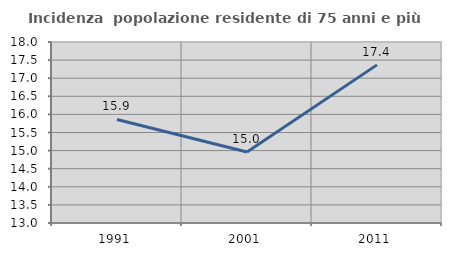
| Category | Incidenza  popolazione residente di 75 anni e più |
|---|---|
| 1991.0 | 15.86 |
| 2001.0 | 14.963 |
| 2011.0 | 17.368 |